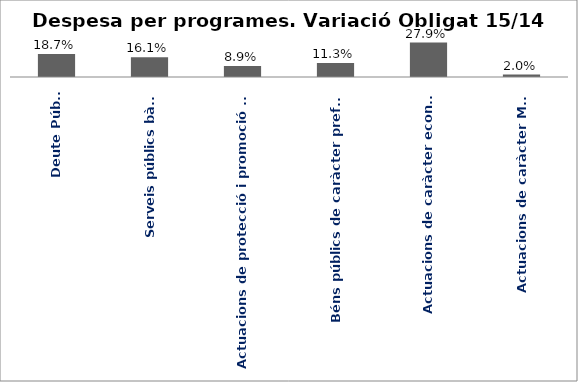
| Category | Series 0 |
|---|---|
| Deute Públic | 0.187 |
| Serveis públics bàsics | 0.161 |
| Actuacions de protecció i promoció social | 0.089 |
| Béns públics de caràcter preferent | 0.113 |
| Actuacions de caràcter econòmic | 0.279 |
| Actuacions de caràcter Marçal | 0.02 |